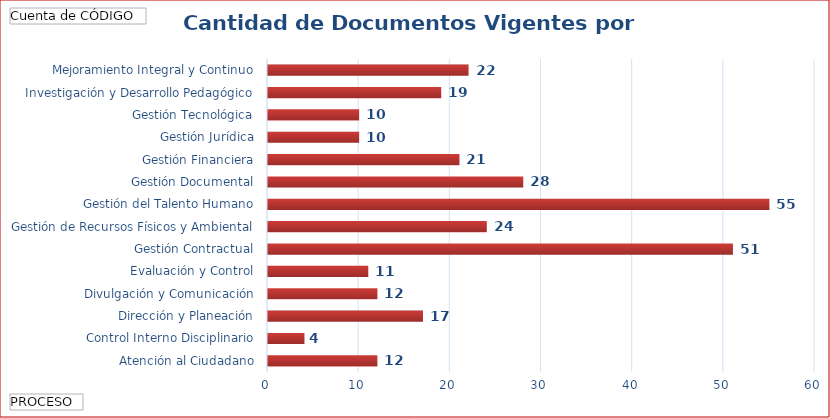
| Category | Total |
|---|---|
| Atención al Ciudadano | 12 |
| Control Interno Disciplinario | 4 |
| Dirección y Planeación | 17 |
| Divulgación y Comunicación | 12 |
| Evaluación y Control | 11 |
| Gestión Contractual | 51 |
| Gestión de Recursos Físicos y Ambiental | 24 |
| Gestión del Talento Humano | 55 |
| Gestión Documental | 28 |
| Gestión Financiera | 21 |
| Gestión Jurídica | 10 |
| Gestión Tecnológica | 10 |
| Investigación y Desarrollo Pedagógico | 19 |
| Mejoramiento Integral y Continuo | 22 |